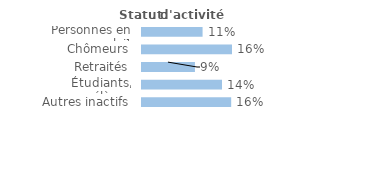
| Category | Series 0 |
|---|---|
| Personnes en emploi¹ | 0.107 |
| Chômeurs | 0.159 |
| Retraités | 0.093 |
| Étudiants, élèves | 0.141 |
| Autres inactifs  | 0.157 |